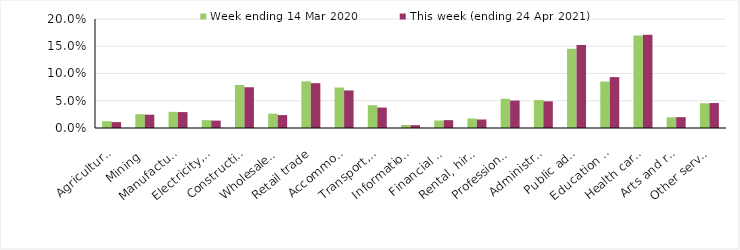
| Category | Week ending 14 Mar 2020 | This week (ending 24 Apr 2021) |
|---|---|---|
| Agriculture, forestry and fishing | 0.012 | 0.011 |
| Mining | 0.025 | 0.024 |
| Manufacturing | 0.03 | 0.029 |
| Electricity, gas, water and waste services | 0.014 | 0.014 |
| Construction | 0.079 | 0.075 |
| Wholesale trade | 0.026 | 0.024 |
| Retail trade | 0.086 | 0.082 |
| Accommodation and food services | 0.074 | 0.069 |
| Transport, postal and warehousing | 0.042 | 0.038 |
| Information media and telecommunications | 0.006 | 0.005 |
| Financial and insurance services | 0.014 | 0.014 |
| Rental, hiring and real estate services | 0.017 | 0.016 |
| Professional, scientific and technical services | 0.054 | 0.05 |
| Administrative and support services | 0.051 | 0.049 |
| Public administration and safety | 0.145 | 0.152 |
| Education and training | 0.085 | 0.093 |
| Health care and social assistance | 0.17 | 0.171 |
| Arts and recreation services | 0.02 | 0.02 |
| Other services | 0.045 | 0.046 |